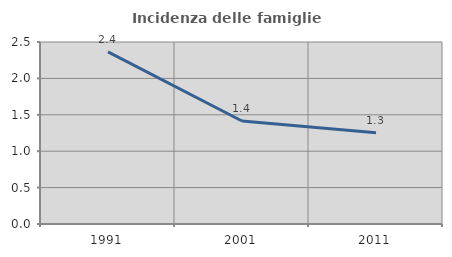
| Category | Incidenza delle famiglie numerose |
|---|---|
| 1991.0 | 2.363 |
| 2001.0 | 1.415 |
| 2011.0 | 1.254 |